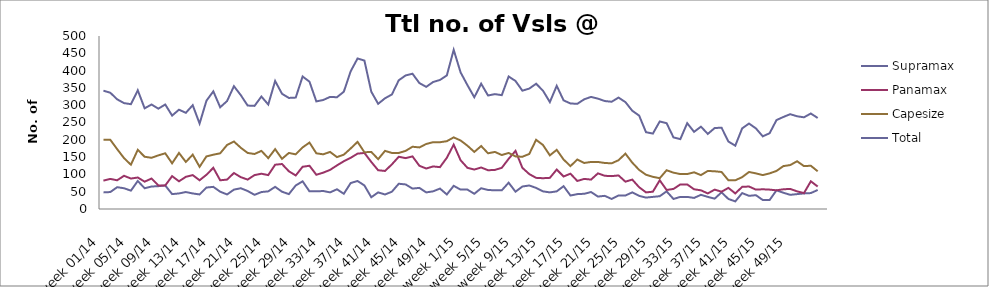
| Category | Supramax | Panamax | Capesize | Total |
|---|---|---|---|---|
| week 01/14 | 48 | 82 | 200 | 342 |
| week 02/14 | 49 | 87 | 200 | 336 |
| week 03/14 | 63 | 83 | 173 | 317 |
| week 04/14 | 60 | 96 | 147 | 306 |
| week 05/14 | 53 | 88 | 128 | 303 |
| week 06/14 | 81 | 91 | 171 | 343 |
| week 07/14 | 60 | 79 | 151 | 291 |
| week 08/14 | 65 | 88 | 148 | 302 |
| week 09/14 | 66 | 68 | 155 | 290 |
| week 10/14 | 68 | 68 | 161 | 302 |
| week 11/14 | 43 | 95 | 132 | 270 |
| week 12/14 | 45 | 80 | 162 | 287 |
| week 13/14 | 49 | 93 | 136 | 278 |
| week 14/14 | 45 | 98 | 157 | 300 |
| week 15/14 | 42 | 83 | 122 | 247 |
| week 16/14 | 62 | 99 | 152 | 313 |
| week 17/14 | 64 | 119 | 157 | 340 |
| week 18/14 | 50 | 83 | 161 | 294 |
| week 19/14 | 42 | 85 | 185 | 312 |
| week 20/14 | 56 | 104 | 195 | 355 |
| week 21/14 | 60 | 92 | 177 | 329 |
| week 22/14 | 52 | 85 | 162 | 299 |
| week 23/14 | 41 | 98 | 159 | 298 |
| week 24/14 | 49 | 102 | 168 | 325 |
| week 25/14 | 51 | 98 | 147 | 302 |
| week 26/14 | 64 | 128 | 173 | 370 |
| week 27/14 | 50 | 130 | 145 | 333 |
| week 28/14 | 43 | 109 | 162 | 321 |
| week 29/14 | 68 | 97 | 158 | 322 |
| week 30/14 | 80 | 122 | 178 | 383 |
| week 31/14 | 51 | 125 | 192 | 368 |
| week 32/14 | 51 | 99 | 161 | 311 |
| week 33/14 | 52 | 105 | 158 | 315 |
| week 34/14 | 48 | 113 | 165 | 324 |
| week 35/14 | 57 | 126 | 150 | 323 |
| week 36/14 | 44 | 138 | 157 | 339 |
| week 37/14 | 75 | 148 | 175 | 398 |
| week 38/14 | 81 | 160 | 194 | 435 |
| week 39/14 | 68 | 162 | 164 | 429 |
| week 40/14 | 34 | 136 | 165 | 339 |
| week 41/14 | 48 | 112 | 144 | 304 |
| week 42/14 | 42 | 110 | 168 | 320 |
| week 43/14 | 50 | 129 | 162 | 331 |
| week 44/14 | 73 | 151 | 162 | 372 |
| week 45/14 | 71 | 147 | 168 | 386 |
| week 46/14 | 59 | 152 | 180 | 391 |
| week 47/14 | 61 | 125 | 178 | 364 |
| week 48/14 | 48 | 117 | 188 | 353 |
| week 49/14 | 51 | 123 | 193 | 367 |
| week 50/14 | 59 | 121 | 193 | 373 |
| week 51/14 | 42 | 148 | 196 | 386 |
| week 52/14 | 67 | 186 | 207 | 460 |
| week 1/15 | 56 | 141 | 198 | 395 |
| week 2/15 | 56 | 119 | 183 | 358 |
| week 3/15 | 44 | 114 | 165 | 323 |
| week 4/15 | 60 | 120 | 182 | 362 |
| week 5/15 | 55 | 112 | 161 | 328 |
| week 6/15 | 54 | 113 | 165 | 332 |
| week 7/15 | 54 | 119 | 156 | 329 |
| week 8/15 | 76 | 145 | 162 | 383 |
| week 9/15 | 50 | 168 | 152 | 370 |
| week 10/15 | 65 | 119 | 151 | 342 |
| week 11/15 | 68 | 101 | 159 | 348 |
| week 12/15 | 61 | 90 | 200 | 362 |
| week 13/15 | 51 | 89 | 185 | 342 |
| week 14/15 | 48 | 90 | 155 | 309 |
| week 15/15 | 51 | 114 | 171 | 356 |
| week 16/15 | 66 | 94 | 143 | 314 |
| week 17/15 | 39 | 102 | 124 | 305 |
| week 18/15 | 43 | 81 | 143 | 304 |
| week 19/15 | 44 | 87 | 133 | 317 |
| week 20/15 | 49 | 85 | 136 | 324 |
| week 21/15 | 36 | 103 | 136 | 319 |
| week 22/15 | 38 | 96 | 133 | 312 |
| week 23/15 | 29 | 95 | 132 | 310 |
| week 24/15 | 39 | 97 | 141 | 322 |
| week 25/15 | 39 | 79 | 160 | 309 |
| week 26/15 | 48 | 85 | 134 | 284 |
| week 27/15 | 38 | 63 | 113 | 270 |
| week 28/15 | 33 | 48 | 99 | 222 |
| week 29/15 | 35 | 50 | 93 | 218 |
| week 30/15 | 37 | 83 | 89 | 253 |
| week 31/15 | 51 | 55 | 112 | 248 |
| week 32/15 | 29 | 58 | 105 | 207 |
| week 33/15 | 35 | 71 | 101 | 202 |
| week 34/15 | 35 | 71 | 101 | 248 |
| week 35/15 | 32 | 57 | 106 | 223 |
| week 36/15 | 41 | 54 | 98 | 238 |
| week 37/15 | 35 | 45 | 110 | 217 |
| week 38/15 | 30 | 56 | 109 | 234 |
| week 39/15 | 48 | 50 | 107 | 235 |
| week 40/15 | 29 | 61 | 83 | 195 |
| week 41/15 | 22 | 45 | 83 | 183 |
| week 42/15 | 46 | 64 | 92 | 233 |
| week 43/15 | 38 | 65 | 107 | 247 |
| week 44/15 | 40 | 56 | 103 | 233 |
| week 45/15 | 26 | 57 | 98 | 210 |
| week 46/15 | 26 | 56 | 103 | 219 |
| week 47/15 | 54 | 54 | 110 | 257 |
| week 48/15 | 47 | 57 | 124 | 266 |
| week 49/15 | 41 | 58 | 127 | 274 |
| week 50/15 | 43 | 51 | 138 | 268 |